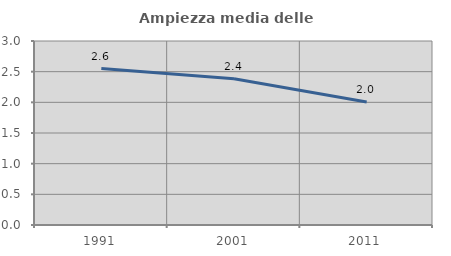
| Category | Ampiezza media delle famiglie |
|---|---|
| 1991.0 | 2.551 |
| 2001.0 | 2.385 |
| 2011.0 | 2.005 |